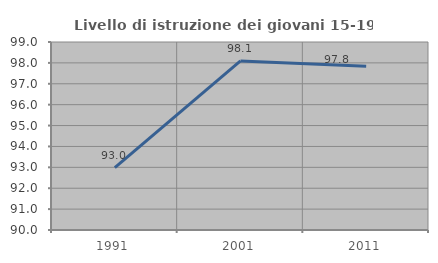
| Category | Livello di istruzione dei giovani 15-19 anni |
|---|---|
| 1991.0 | 92.982 |
| 2001.0 | 98.095 |
| 2011.0 | 97.842 |